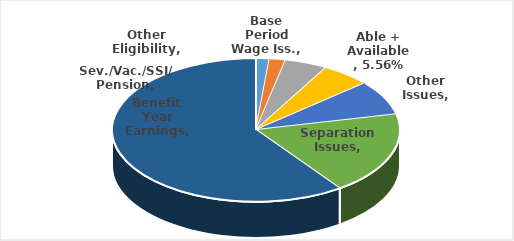
| Category | Series 0 |
|---|---|
| Base Period Wage Iss. | 0.015 |
| Other Eligibility | 0.018 |
| Sev./Vac./SSI/ Pension | 0.048 |
| Able + Available | 0.056 |
| Other Issues | 0.078 |
| Separation Issues | 0.186 |
| Benefit Year Earnings | 0.599 |